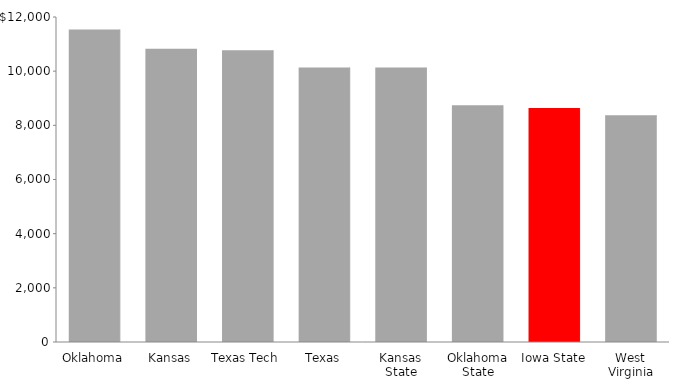
| Category | Series 0 |
|---|---|
| Oklahoma | 11538 |
| Kansas | 10824 |
| Texas Tech | 10771 |
| Texas | 10136 |
| Kansas State | 10135 |
| Oklahoma State | 8738 |
| Iowa State | 8636 |
| West Virginia | 8376 |